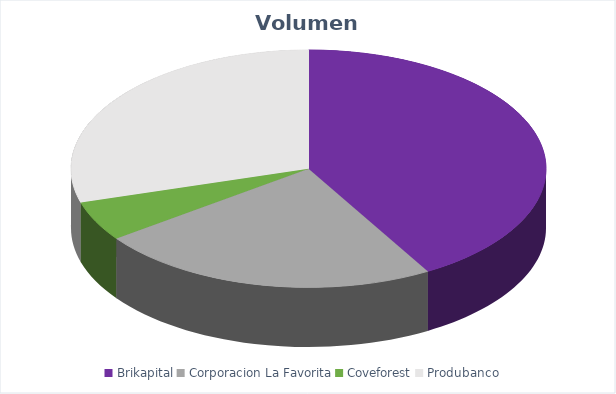
| Category | VOLUMEN ($USD) |
|---|---|
| Brikapital | 20000 |
| Corporacion La Favorita | 11214.45 |
| Coveforest | 2600 |
| Produbanco | 14219.7 |